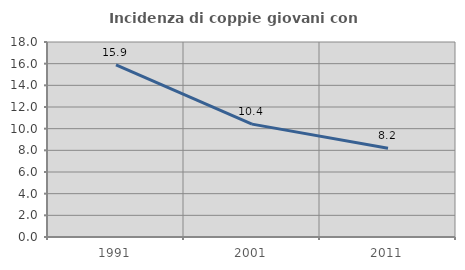
| Category | Incidenza di coppie giovani con figli |
|---|---|
| 1991.0 | 15.894 |
| 2001.0 | 10.42 |
| 2011.0 | 8.183 |